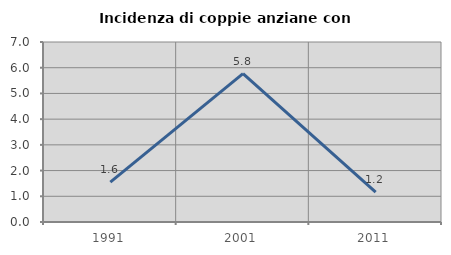
| Category | Incidenza di coppie anziane con figli |
|---|---|
| 1991.0 | 1.55 |
| 2001.0 | 5.769 |
| 2011.0 | 1.163 |